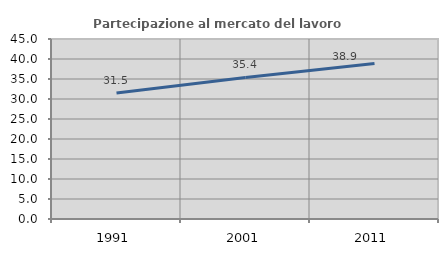
| Category | Partecipazione al mercato del lavoro  femminile |
|---|---|
| 1991.0 | 31.5 |
| 2001.0 | 35.385 |
| 2011.0 | 38.86 |